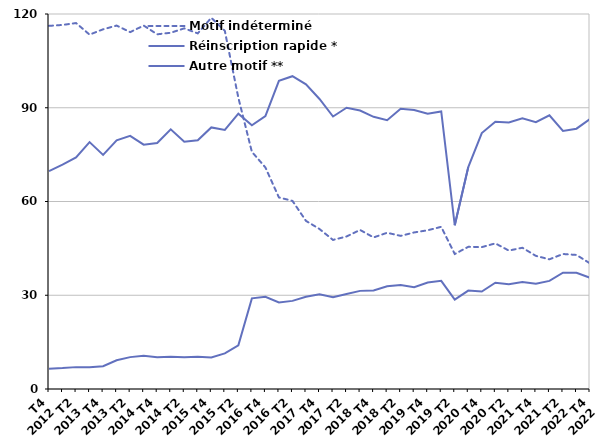
| Category | Motif indéterminé | Réinscription rapide * | Autre motif ** |
|---|---|---|---|
| T4
2012 | 116.2 | 69.7 | 6.5 |
| T1
2013 | 116.5 | 71.8 | 6.7 |
| T2
2013 | 117.1 | 74.1 | 7 |
| T3
2013 | 113.4 | 79 | 7 |
| T4
2013 | 115.1 | 74.9 | 7.3 |
| T1
2014 | 116.3 | 79.6 | 9.2 |
| T2
2014 | 114.2 | 81 | 10.2 |
| T3
2014 | 116.3 | 78.2 | 10.6 |
| T4
2014 | 113.5 | 78.7 | 10.2 |
| T1
2015 | 114 | 83.1 | 10.3 |
| T2
2015 | 115.4 | 79.1 | 10.2 |
| T3
2015 | 113.8 | 79.6 | 10.3 |
| T4
2015 | 118.8 | 83.7 | 10.1 |
| T1
2016 | 114.6 | 82.9 | 11.4 |
| T2
2016 | 93.2 | 88.1 | 14 |
| T3
2016 | 75.9 | 84.4 | 29 |
| T4
2016 | 70.9 | 87.3 | 29.5 |
| T1
2017 | 61.3 | 98.6 | 27.7 |
| T2
2017 | 60.2 | 100.1 | 28.2 |
| T3
2017 | 53.8 | 97.5 | 29.5 |
| T4
2017 | 51.2 | 92.8 | 30.3 |
| T1
2018 | 47.7 | 87.2 | 29.4 |
| T2
2018 | 48.8 | 90 | 30.4 |
| T3
2018 | 50.9 | 89.1 | 31.4 |
| T4
2018 | 48.5 | 87.1 | 31.5 |
| T1
2019 | 50 | 86 | 32.9 |
| T2
2019 | 49 | 89.7 | 33.3 |
| T3
2019 | 50.1 | 89.3 | 32.6 |
| T4
2019 | 50.8 | 88.1 | 34.1 |
| T1
2020 | 51.9 | 88.8 | 34.6 |
| T2
2020 | 43.2 | 52.4 | 28.6 |
| T3
2020 | 45.5 | 71 | 31.5 |
| T4
2020 | 45.4 | 81.9 | 31.2 |
| T1
2021 | 46.6 | 85.5 | 34 |
| T2
2021 | 44.3 | 85.3 | 33.5 |
| T3
2021 | 45.2 | 86.6 | 34.2 |
| T4
2021 | 42.6 | 85.4 | 33.7 |
| T1
2022 | 41.5 | 87.6 | 34.6 |
| T2
2022 | 43.2 | 82.6 | 37.2 |
| T3
2022 | 42.9 | 83.3 | 37.2 |
| T4
2022 | 40.2 | 86.4 | 35.6 |